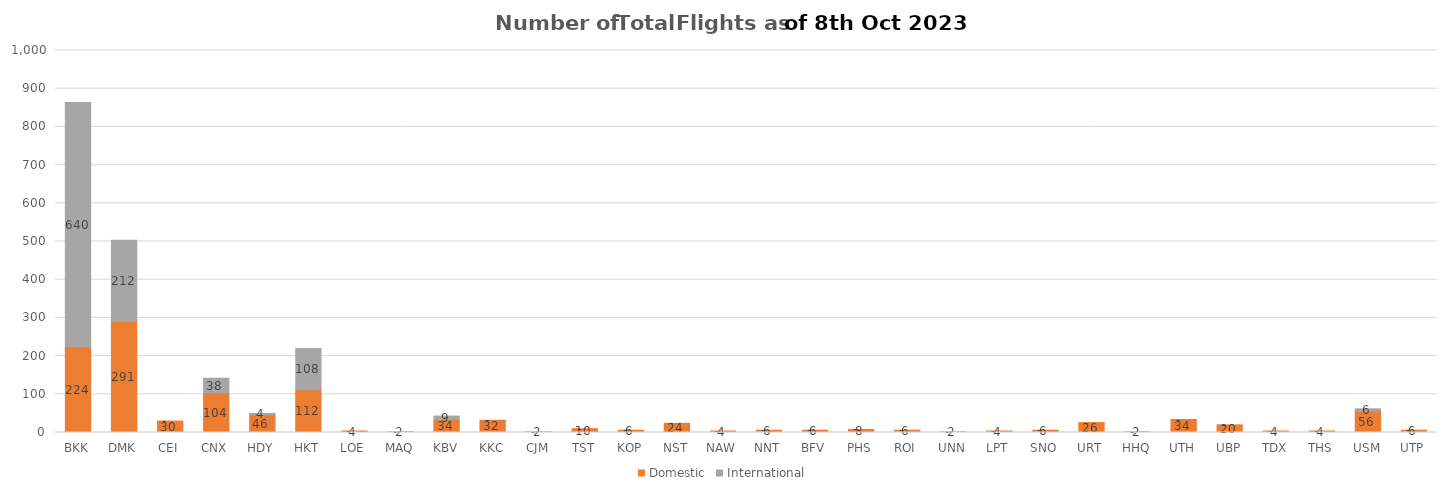
| Category | Domestic | International |
|---|---|---|
| BKK | 224 | 640 |
| DMK | 291 | 212 |
| CEI | 30 | 0 |
| CNX | 104 | 38 |
| HDY | 46 | 4 |
| HKT | 112 | 108 |
| LOE | 4 | 0 |
| MAQ | 2 | 0 |
| KBV | 34 | 9 |
| KKC | 32 | 0 |
| CJM | 2 | 0 |
| TST | 10 | 0 |
| KOP | 6 | 0 |
| NST | 24 | 0 |
| NAW | 4 | 0 |
| NNT | 6 | 0 |
| BFV | 6 | 0 |
| PHS | 8 | 0 |
| ROI | 6 | 0 |
| UNN | 2 | 0 |
| LPT | 4 | 0 |
| SNO | 6 | 0 |
| URT | 26 | 0 |
| HHQ | 2 | 0 |
| UTH | 34 | 0 |
| UBP | 20 | 0 |
| TDX | 4 | 0 |
| THS | 4 | 0 |
| USM | 56 | 6 |
| UTP | 6 | 0 |